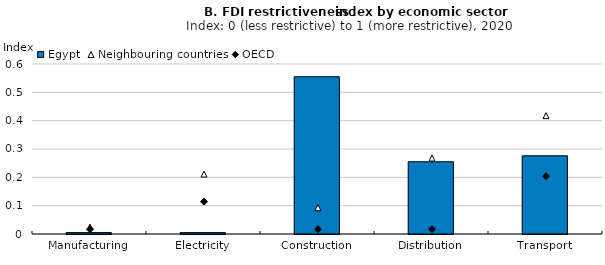
| Category | Egypt |
|---|---|
| Manufacturing | 0.005 |
| Electricity | 0.005 |
| Construction | 0.555 |
| Distribution | 0.255 |
| Transport | 0.276 |